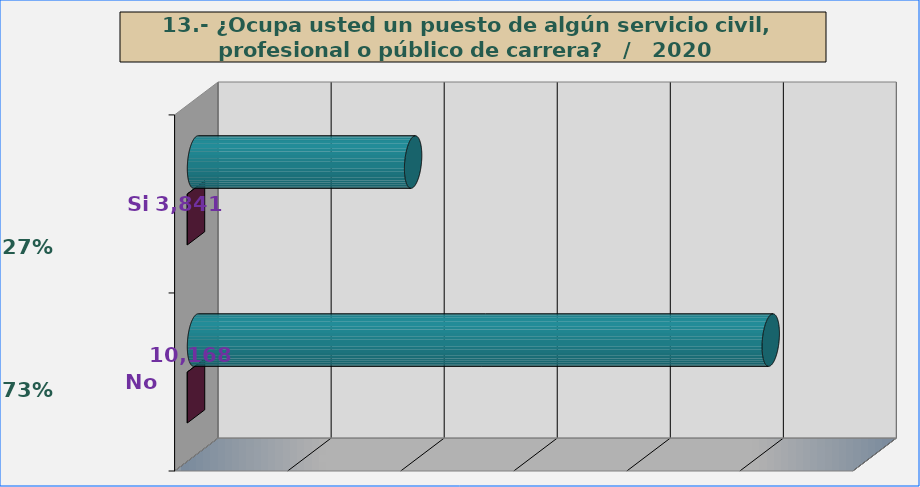
| Category | Series 0 | Series 1 |
|---|---|---|
| Si | 3841 | 0.274 |
| No | 10168 | 0.726 |